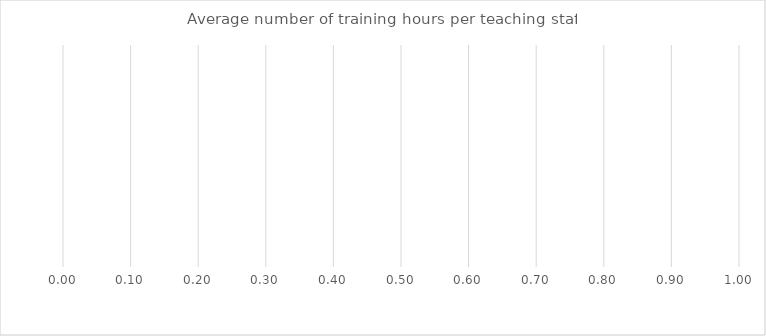
| Category | Benchmark | Entire LEA  | Title IV-A Identified Schools |
|---|---|---|---|
| Average number of training hours per teaching staff | 0 | 0 | 0 |